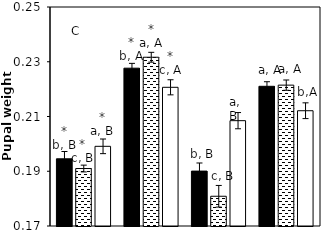
| Category | AB | AC | CK |
|---|---|---|---|
| aCO2-Bt | 0.195 | 0.191 | 0.199 |
| aCO2-Xy | 0.228 | 0.232 | 0.221 |
| eCO2-Bt | 0.19 | 0.181 | 0.208 |
| eCO2-Xy | 0.221 | 0.221 | 0.212 |